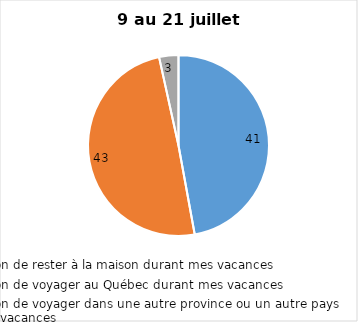
| Category | Series 0 |
|---|---|
| J’ai l’intention de rester à la maison durant mes vacances | 41 |
| J’ai l’intention de voyager au Québec durant mes vacances | 43 |
| J’ai l’intention de voyager dans une autre province ou un autre pays durant mes vacances | 3 |